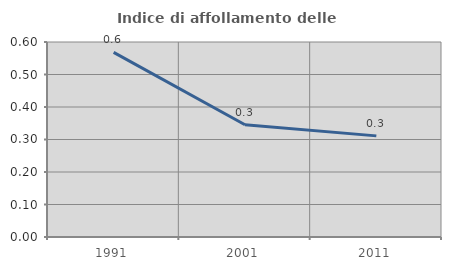
| Category | Indice di affollamento delle abitazioni  |
|---|---|
| 1991.0 | 0.568 |
| 2001.0 | 0.345 |
| 2011.0 | 0.311 |